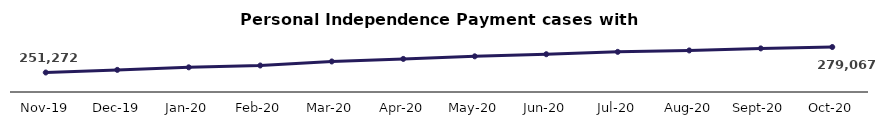
| Category | Series 0 |
|---|---|
| 2019-11-01 | 251272 |
| 2019-12-01 | 254132 |
| 2020-01-01 | 256927 |
| 2020-02-01 | 258906 |
| 2020-03-01 | 263314 |
| 2020-04-01 | 266095 |
| 2020-05-01 | 268925 |
| 2020-06-01 | 271212 |
| 2020-07-01 | 273790 |
| 2020-08-01 | 275338 |
| 2020-09-01 | 277550 |
| 2020-10-01 | 279067 |